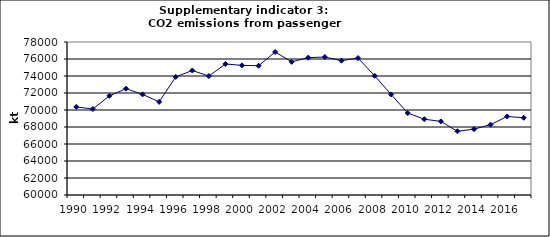
| Category | CO2 emissions from passenger cars, kt |
|---|---|
| 1990 | 70358.764 |
| 1991 | 70114.77 |
| 1992 | 71668.73 |
| 1993 | 72501.887 |
| 1994 | 71836.59 |
| 1995 | 70956.339 |
| 1996 | 73893.332 |
| 1997 | 74650.735 |
| 1998 | 73991.219 |
| 1999 | 75417.059 |
| 2000 | 75248.674 |
| 2001 | 75209.469 |
| 2002 | 76822.895 |
| 2003 | 75667.519 |
| 2004 | 76162.685 |
| 2005 | 76232.898 |
| 2006 | 75803.168 |
| 2007 | 76115.705 |
| 2008 | 74028.83 |
| 2009 | 71827.869 |
| 2010 | 69642.742 |
| 2011 | 68917.627 |
| 2012 | 68659.502 |
| 2013 | 67499.85 |
| 2014 | 67748.194 |
| 2015 | 68280.132 |
| 2016 | 69239.023 |
| 2017 | 69086.147 |